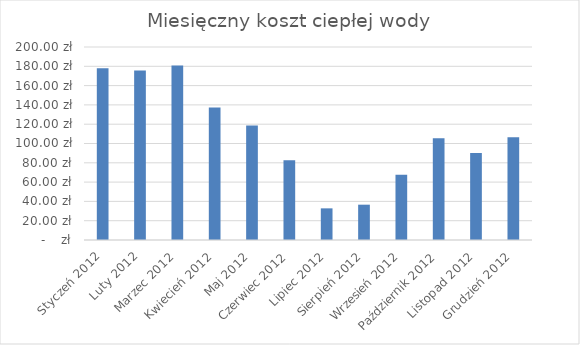
| Category | Series 0 |
|---|---|
| Styczeń 2012 | 178.059 |
| Luty 2012 | 175.68 |
| Marzec 2012 | 180.896 |
| Kwiecień 2012 | 137.268 |
| Maj 2012 | 118.749 |
| Czerwiec 2012 | 82.551 |
| Lipiec 2012 | 32.791 |
| Sierpień 2012 | 36.602 |
| Wrzesień 2012 | 67.665 |
| Październik 2012 | 105.432 |
| Listopad 2012 | 90.255 |
| Grudzień 2012 | 106.453 |